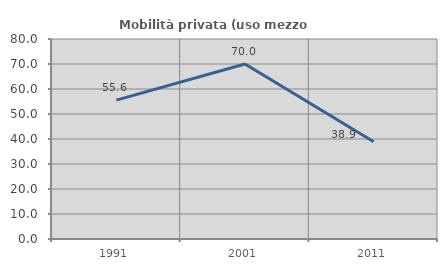
| Category | Mobilità privata (uso mezzo privato) |
|---|---|
| 1991.0 | 55.556 |
| 2001.0 | 70 |
| 2011.0 | 38.889 |